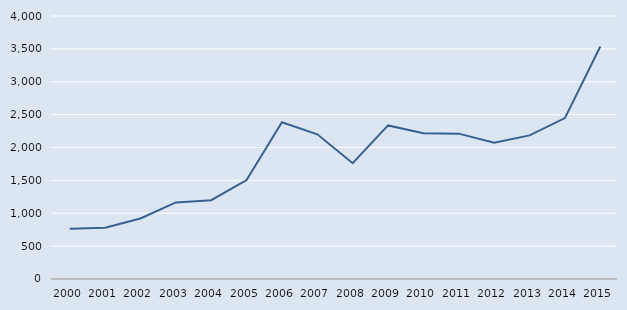
| Category | Series 0 |
|---|---|
| 2000.0 | 765 |
| 2001.0 | 779 |
| 2002.0 | 920 |
| 2003.0 | 1165 |
| 2004.0 | 1199 |
| 2005.0 | 1505 |
| 2006.0 | 2383 |
| 2007.0 | 2201 |
| 2008.0 | 1761 |
| 2009.0 | 2336 |
| 2010.0 | 2217 |
| 2011.0 | 2211 |
| 2012.0 | 2071 |
| 2013.0 | 2184 |
| 2014.0 | 2447 |
| 2015.0 | 3537 |